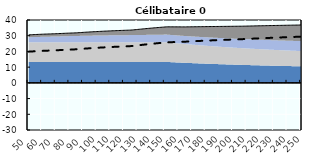
| Category | Coin fiscal moyen (somme des composantes) | Taux moyen d'imposition net en % du salaire brut |
|---|---|---|
| 50.0 | 30.521 | 19.849 |
| 51.0 | 30.572 | 19.908 |
| 52.0 | 30.621 | 19.965 |
| 53.0 | 30.668 | 20.019 |
| 54.0 | 30.713 | 20.071 |
| 55.0 | 30.757 | 20.121 |
| 56.0 | 30.799 | 20.17 |
| 57.0 | 30.84 | 20.217 |
| 58.0 | 30.879 | 20.262 |
| 59.0 | 30.917 | 20.306 |
| 60.0 | 30.954 | 20.348 |
| 61.0 | 30.989 | 20.389 |
| 62.0 | 31.023 | 20.428 |
| 63.0 | 31.056 | 20.467 |
| 64.0 | 31.089 | 20.504 |
| 65.0 | 31.12 | 20.54 |
| 66.0 | 31.15 | 20.575 |
| 67.0 | 31.179 | 20.608 |
| 68.0 | 31.208 | 20.641 |
| 69.0 | 31.235 | 20.673 |
| 70.0 | 31.265 | 20.707 |
| 71.0 | 31.31 | 20.759 |
| 72.0 | 31.353 | 20.809 |
| 73.0 | 31.395 | 20.857 |
| 74.0 | 31.436 | 20.904 |
| 75.0 | 31.476 | 20.95 |
| 76.0 | 31.514 | 20.995 |
| 77.0 | 31.552 | 21.039 |
| 78.0 | 31.589 | 21.081 |
| 79.0 | 31.625 | 21.123 |
| 80.0 | 31.66 | 21.163 |
| 81.0 | 31.694 | 21.202 |
| 82.0 | 31.727 | 21.241 |
| 83.0 | 31.76 | 21.278 |
| 84.0 | 31.792 | 21.315 |
| 85.0 | 31.824 | 21.352 |
| 86.0 | 31.888 | 21.426 |
| 87.0 | 31.951 | 21.498 |
| 88.0 | 32.012 | 21.569 |
| 89.0 | 32.071 | 21.638 |
| 90.0 | 32.13 | 21.705 |
| 91.0 | 32.187 | 21.771 |
| 92.0 | 32.243 | 21.835 |
| 93.0 | 32.297 | 21.898 |
| 94.0 | 32.351 | 21.96 |
| 95.0 | 32.403 | 22.02 |
| 96.0 | 32.454 | 22.079 |
| 97.0 | 32.505 | 22.137 |
| 98.0 | 32.554 | 22.194 |
| 99.0 | 32.602 | 22.25 |
| 100.0 | 32.649 | 22.304 |
| 101.0 | 32.696 | 22.358 |
| 102.0 | 32.741 | 22.41 |
| 103.0 | 32.785 | 22.461 |
| 104.0 | 32.829 | 22.512 |
| 105.0 | 32.872 | 22.561 |
| 106.0 | 32.914 | 22.609 |
| 107.0 | 32.955 | 22.657 |
| 108.0 | 32.996 | 22.704 |
| 109.0 | 33.035 | 22.75 |
| 110.0 | 33.074 | 22.795 |
| 111.0 | 33.113 | 22.839 |
| 112.0 | 33.15 | 22.882 |
| 113.0 | 33.187 | 22.925 |
| 114.0 | 33.223 | 22.967 |
| 115.0 | 33.259 | 23.008 |
| 116.0 | 33.294 | 23.048 |
| 117.0 | 33.329 | 23.088 |
| 118.0 | 33.362 | 23.127 |
| 119.0 | 33.396 | 23.165 |
| 120.0 | 33.428 | 23.203 |
| 121.0 | 33.461 | 23.24 |
| 122.0 | 33.492 | 23.277 |
| 123.0 | 33.524 | 23.313 |
| 124.0 | 33.554 | 23.348 |
| 125.0 | 33.589 | 23.388 |
| 126.0 | 33.664 | 23.475 |
| 127.0 | 33.739 | 23.561 |
| 128.0 | 33.812 | 23.646 |
| 129.0 | 33.904 | 23.751 |
| 130.0 | 33.995 | 23.856 |
| 131.0 | 34.085 | 23.96 |
| 132.0 | 34.173 | 24.062 |
| 133.0 | 34.26 | 24.163 |
| 134.0 | 34.346 | 24.262 |
| 135.0 | 34.431 | 24.359 |
| 136.0 | 34.514 | 24.455 |
| 137.0 | 34.596 | 24.55 |
| 138.0 | 34.677 | 24.643 |
| 139.0 | 34.757 | 24.735 |
| 140.0 | 34.835 | 24.826 |
| 141.0 | 34.913 | 24.916 |
| 142.0 | 34.989 | 25.004 |
| 143.0 | 35.065 | 25.091 |
| 144.0 | 35.139 | 25.176 |
| 145.0 | 35.212 | 25.261 |
| 146.0 | 35.284 | 25.344 |
| 147.0 | 35.356 | 25.426 |
| 148.0 | 35.426 | 25.508 |
| 149.0 | 35.495 | 25.588 |
| 150.0 | 35.564 | 25.667 |
| 151.0 | 35.631 | 25.744 |
| 152.0 | 35.652 | 25.794 |
| 153.0 | 35.649 | 25.828 |
| 154.0 | 35.645 | 25.862 |
| 155.0 | 35.642 | 25.896 |
| 156.0 | 35.639 | 25.929 |
| 157.0 | 35.636 | 25.962 |
| 158.0 | 35.632 | 25.994 |
| 159.0 | 35.629 | 26.026 |
| 160.0 | 35.626 | 26.057 |
| 161.0 | 35.623 | 26.088 |
| 162.0 | 35.62 | 26.119 |
| 163.0 | 35.617 | 26.149 |
| 164.0 | 35.614 | 26.179 |
| 165.0 | 35.613 | 26.21 |
| 166.0 | 35.626 | 26.258 |
| 167.0 | 35.639 | 26.305 |
| 168.0 | 35.652 | 26.352 |
| 169.0 | 35.664 | 26.397 |
| 170.0 | 35.677 | 26.443 |
| 171.0 | 35.689 | 26.488 |
| 172.0 | 35.701 | 26.532 |
| 173.0 | 35.714 | 26.576 |
| 174.0 | 35.726 | 26.619 |
| 175.0 | 35.737 | 26.662 |
| 176.0 | 35.749 | 26.704 |
| 177.0 | 35.761 | 26.746 |
| 178.0 | 35.772 | 26.787 |
| 179.0 | 35.784 | 26.828 |
| 180.0 | 35.795 | 26.869 |
| 181.0 | 35.806 | 26.909 |
| 182.0 | 35.817 | 26.948 |
| 183.0 | 35.828 | 26.987 |
| 184.0 | 35.839 | 27.026 |
| 185.0 | 35.85 | 27.064 |
| 186.0 | 35.86 | 27.102 |
| 187.0 | 35.871 | 27.14 |
| 188.0 | 35.881 | 27.177 |
| 189.0 | 35.891 | 27.213 |
| 190.0 | 35.902 | 27.25 |
| 191.0 | 35.912 | 27.286 |
| 192.0 | 35.922 | 27.321 |
| 193.0 | 35.932 | 27.356 |
| 194.0 | 35.941 | 27.391 |
| 195.0 | 35.951 | 27.425 |
| 196.0 | 35.961 | 27.46 |
| 197.0 | 35.97 | 27.493 |
| 198.0 | 35.98 | 27.527 |
| 199.0 | 35.989 | 27.56 |
| 200.0 | 35.998 | 27.593 |
| 201.0 | 36.007 | 27.625 |
| 202.0 | 36.017 | 27.657 |
| 203.0 | 36.026 | 27.689 |
| 204.0 | 36.034 | 27.72 |
| 205.0 | 36.043 | 27.751 |
| 206.0 | 36.052 | 27.782 |
| 207.0 | 36.063 | 27.816 |
| 208.0 | 36.084 | 27.86 |
| 209.0 | 36.105 | 27.904 |
| 210.0 | 36.125 | 27.947 |
| 211.0 | 36.146 | 27.99 |
| 212.0 | 36.166 | 28.032 |
| 213.0 | 36.186 | 28.075 |
| 214.0 | 36.206 | 28.116 |
| 215.0 | 36.226 | 28.158 |
| 216.0 | 36.245 | 28.199 |
| 217.0 | 36.264 | 28.239 |
| 218.0 | 36.284 | 28.279 |
| 219.0 | 36.303 | 28.319 |
| 220.0 | 36.321 | 28.359 |
| 221.0 | 36.34 | 28.398 |
| 222.0 | 36.359 | 28.437 |
| 223.0 | 36.377 | 28.475 |
| 224.0 | 36.395 | 28.513 |
| 225.0 | 36.413 | 28.551 |
| 226.0 | 36.431 | 28.588 |
| 227.0 | 36.449 | 28.626 |
| 228.0 | 36.466 | 28.662 |
| 229.0 | 36.484 | 28.699 |
| 230.0 | 36.501 | 28.735 |
| 231.0 | 36.518 | 28.771 |
| 232.0 | 36.535 | 28.806 |
| 233.0 | 36.552 | 28.841 |
| 234.0 | 36.569 | 28.876 |
| 235.0 | 36.586 | 28.911 |
| 236.0 | 36.602 | 28.945 |
| 237.0 | 36.619 | 28.979 |
| 238.0 | 36.635 | 29.013 |
| 239.0 | 36.651 | 29.046 |
| 240.0 | 36.667 | 29.08 |
| 241.0 | 36.683 | 29.113 |
| 242.0 | 36.698 | 29.145 |
| 243.0 | 36.714 | 29.177 |
| 244.0 | 36.729 | 29.21 |
| 245.0 | 36.745 | 29.241 |
| 246.0 | 36.76 | 29.273 |
| 247.0 | 36.775 | 29.304 |
| 248.0 | 36.79 | 29.335 |
| 249.0 | 36.812 | 29.374 |
| 250.0 | 36.861 | 29.443 |